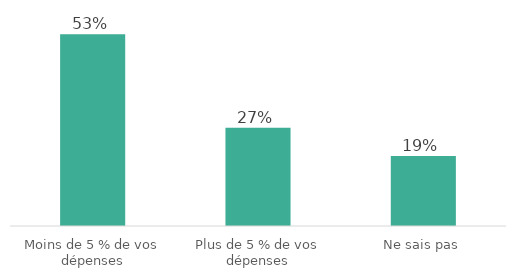
| Category | Series 0 |
|---|---|
| Moins de 5 % de vos dépenses | 53.295 |
| Plus de 5 % de vos dépenses | 27.274 |
| Ne sais pas | 19.431 |